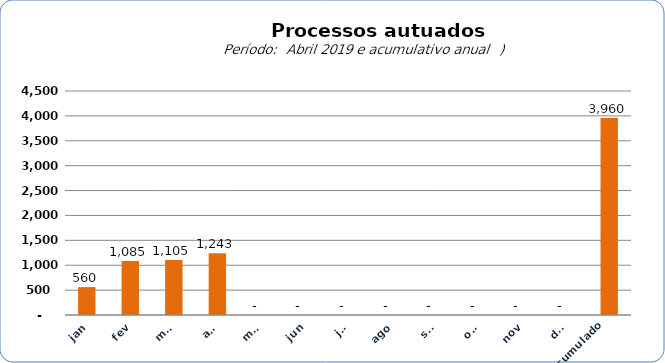
| Category |  6.735   4.276   7.967   6.893   5.569   5.644   6.997   12.080   560   1.085   1.105   1.243   -     -     -     -     -     -     -     -     3.960  |
|---|---|
| jan | 560 |
| fev | 1085 |
| mar | 1105 |
| abr | 1243 |
| mai | 0 |
| jun | 0 |
| jul | 0 |
| ago | 0 |
| set | 0 |
| out | 0 |
| nov | 0 |
| dez | 0 |
| Acumulado
 | 3960 |